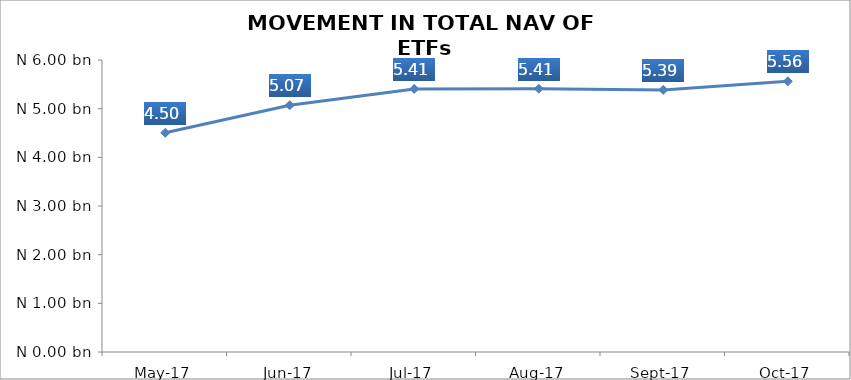
| Category | Series 0 |
|---|---|
| 2017-05-01 | 4504002470.48 |
| 2017-06-01 | 5070730900.48 |
| 2017-07-01 | 5405312682.53 |
| 2017-08-01 | 5410071931.29 |
| 2017-09-01 | 5385378575.54 |
| 2017-10-01 | 5561634501.26 |